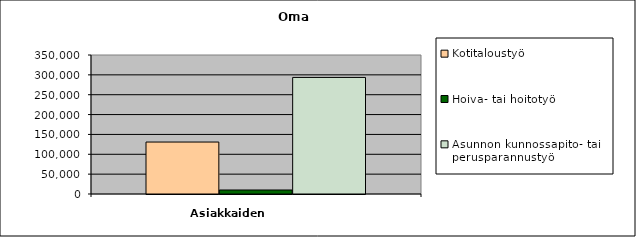
| Category | Kotitaloustyö | Hoiva- tai hoitotyö | Asunnon kunnossapito- tai perusparannustyö |
|---|---|---|---|
| 0 | 130849 | 10086 | 293534 |